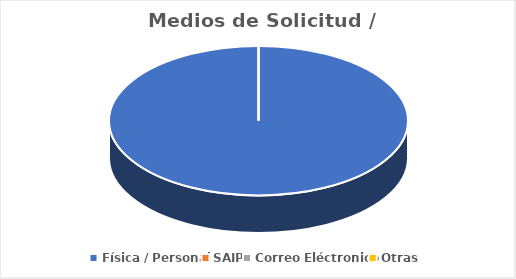
| Category | Series 0 |
|---|---|
| Física / Personal | 1 |
| SAIP | 0 |
| Correo Eléctronico | 0 |
| Otras | 0 |